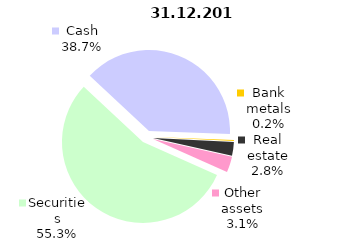
| Category | 31.12.2019** |
|---|---|
| Securities | 1737.5 |
| Cash | 1215.5 |
| Bank metals | 5 |
| Real estate | 86.8 |
| Other assets | 98.5 |